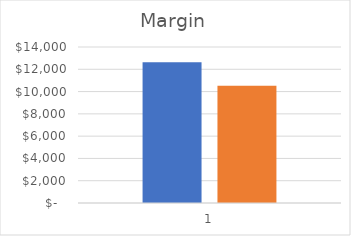
| Category | Series 0 | Series 1 |
|---|---|---|
| 0 | 12624 | 10514 |